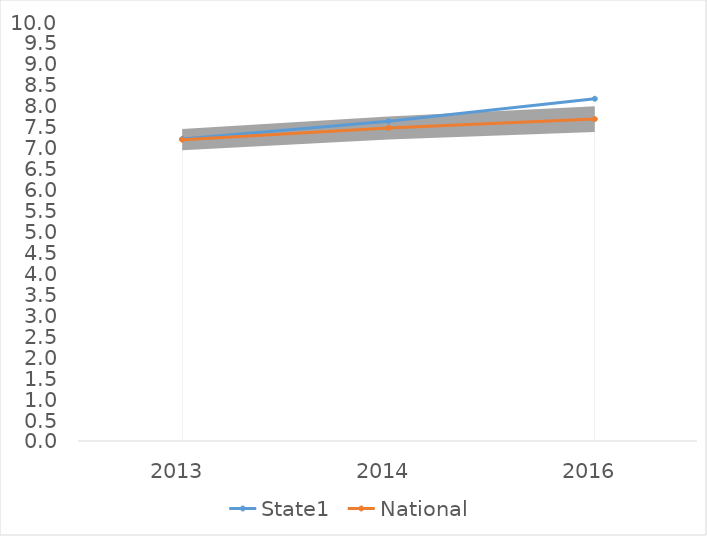
| Category | State1 | National |
|---|---|---|
| 2013.0 | 7.208 | 7.191 |
| 2014.0 | 7.632 | 7.471 |
| 2016.0 | 8.167 | 7.683 |